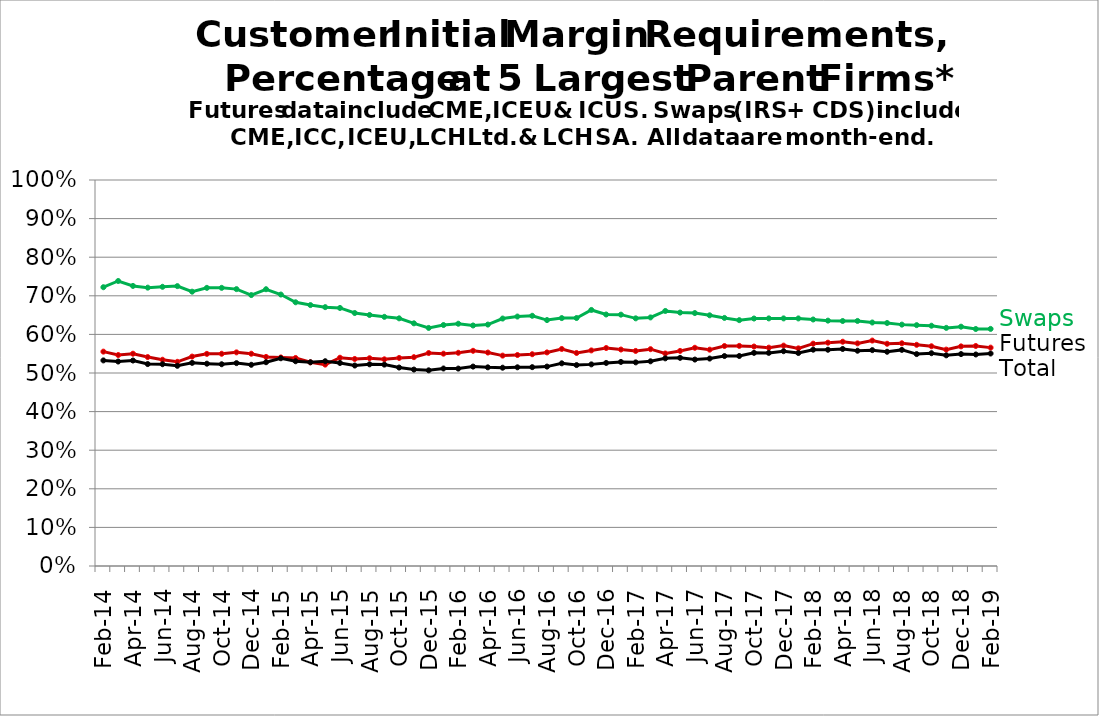
| Category | Futures | Swaps | Total | Series 8 | Series 9 |
|---|---|---|---|---|---|
| 2014-02-28 |  |  |  |  |  |
| nan |  |  |  |  |  |
| 2014-04-30 |  |  |  |  |  |
| nan |  |  |  |  |  |
| 2014-06-30 |  |  |  |  |  |
| nan |  |  |  |  |  |
| 2014-08-29 |  |  |  |  |  |
| nan |  |  |  |  |  |
| 2014-10-31 |  |  |  |  |  |
| nan |  |  |  |  |  |
| 2014-12-31 |  |  |  |  |  |
| nan |  |  |  |  |  |
| 2015-02-27 |  |  |  |  |  |
| nan |  |  |  |  |  |
| 2015-04-30 |  |  |  |  |  |
| nan |  |  |  |  |  |
| 2015-06-30 |  |  |  |  |  |
| nan |  |  |  |  |  |
| 2015-08-31 |  |  |  |  |  |
| nan |  |  |  |  |  |
| 2015-10-30 |  |  |  |  |  |
| nan |  |  |  |  |  |
| 2015-12-31 |  |  |  |  |  |
| nan |  |  |  |  |  |
| 2016-02-29 |  |  |  |  |  |
| nan |  |  |  |  |  |
| 2016-04-29 |  |  |  |  |  |
| nan |  |  |  |  |  |
| 2016-06-30 |  |  |  |  |  |
| nan |  |  |  |  |  |
| 2016-08-31 |  |  |  |  |  |
| nan |  |  |  |  |  |
| 2016-10-31 |  |  |  |  |  |
| nan |  |  |  |  |  |
| 2016-12-30 |  |  |  |  |  |
| nan |  |  |  |  |  |
| 2017-02-28 |  |  |  |  |  |
| nan |  |  |  |  |  |
| 2017-04-28 |  |  |  |  |  |
| nan |  |  |  |  |  |
| 2017-06-30 |  |  |  |  |  |
| nan |  |  |  |  |  |
| 2017-08-31 |  |  |  |  |  |
| nan |  |  |  |  |  |
| 2017-10-31 |  |  |  |  |  |
| nan |  |  |  |  |  |
| 2017-12-29 |  |  |  |  |  |
| nan |  |  |  |  |  |
| 2018-02-28 |  |  |  |  |  |
| nan |  |  |  |  |  |
| 2018-04-30 |  |  |  |  |  |
| nan |  |  |  |  |  |
| 2018-06-29 |  |  |  |  |  |
| nan |  |  |  |  |  |
| 2018-08-31 |  |  |  |  |  |
| nan |  |  |  |  |  |
| 2018-10-31 |  |  |  |  |  |
| nan |  |  |  |  |  |
| 2018-12-31 |  |  |  |  |  |
| nan |  |  |  |  |  |
| 2019-02-28 |  |  |  |  |  |